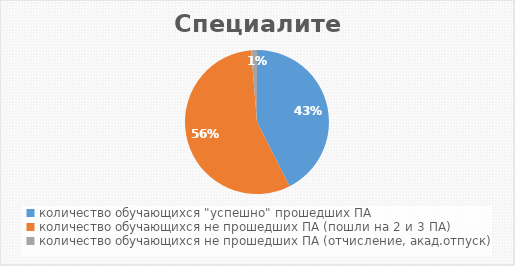
| Category | Специалитет |
|---|---|
| количество обучающихся "успешно" прошедших ПА | 752 |
| количество обучающихся не прошедших ПА (пошли на 2 и 3 ПА) | 994 |
| количество обучающихся не прошедших ПА (отчисление, акад.отпуск) | 23 |